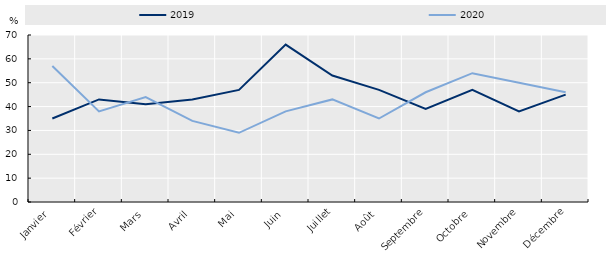
| Category | 2019 | 2020 |
|---|---|---|
| Janvier | 35 | 57 |
| Février | 43 | 38 |
| Mars | 41 | 44 |
| Avril | 43 | 34 |
| Mai | 47 | 29 |
| Juin | 66 | 38 |
| Juillet | 53 | 43 |
| Août | 47 | 35 |
| Septembre | 39 | 46 |
| Octobre | 47 | 54 |
| Novembre | 38 | 50 |
| Décembre | 45 | 46 |